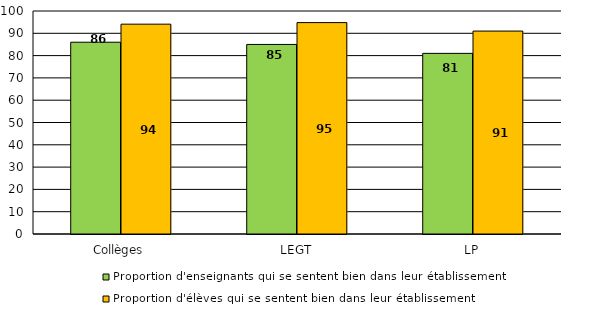
| Category | Proportion d'enseignants qui se sentent bien dans leur établissement | Proportion d'élèves qui se sentent bien dans leur établissement |
|---|---|---|
| Collèges | 86 | 94.1 |
| LEGT | 85 | 94.8 |
| LP | 81 | 91 |